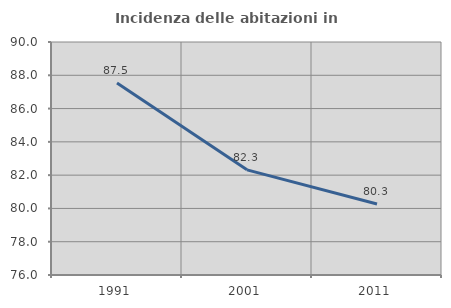
| Category | Incidenza delle abitazioni in proprietà  |
|---|---|
| 1991.0 | 87.535 |
| 2001.0 | 82.319 |
| 2011.0 | 80.263 |